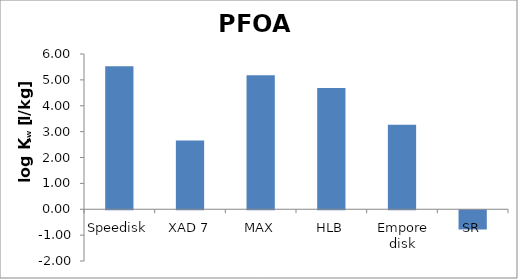
| Category | PFOA  |
|---|---|
| Speedisk | 5.528 |
| XAD 7 | 2.652 |
| MAX | 5.183 |
| HLB | 4.682 |
| Empore disk | 3.267 |
| SR | -0.743 |